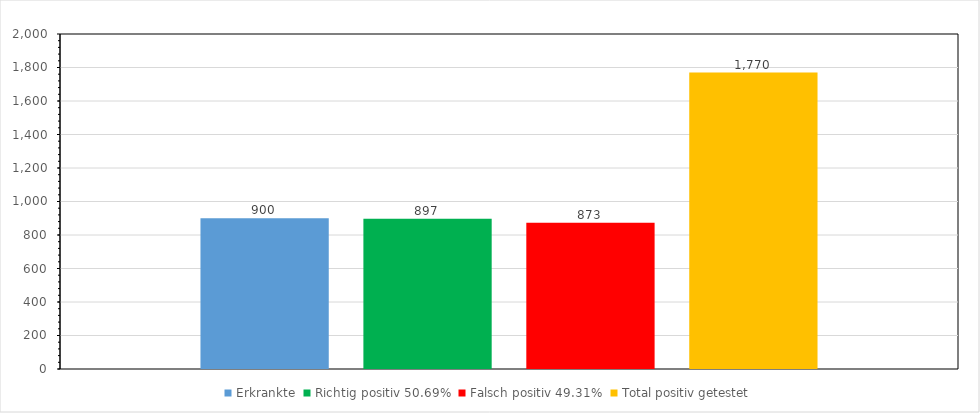
| Category | Erkrankte | Richtig positiv 50.69% | Falsch positiv 49.31% | Total positiv getestet |
|---|---|---|---|---|
| 0 | 900 | 897.3 | 872.7 | 1770 |